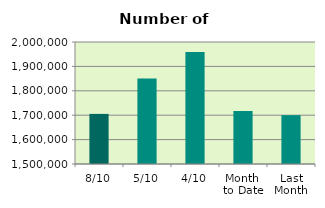
| Category | Series 0 |
|---|---|
| 8/10 | 1705344 |
| 5/10 | 1850852 |
| 4/10 | 1959300 |
| Month 
to Date | 1717242.667 |
| Last
Month | 1700207.9 |